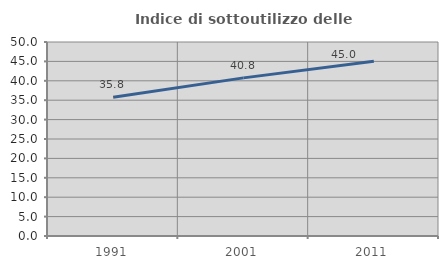
| Category | Indice di sottoutilizzo delle abitazioni  |
|---|---|
| 1991.0 | 35.762 |
| 2001.0 | 40.754 |
| 2011.0 | 45.023 |